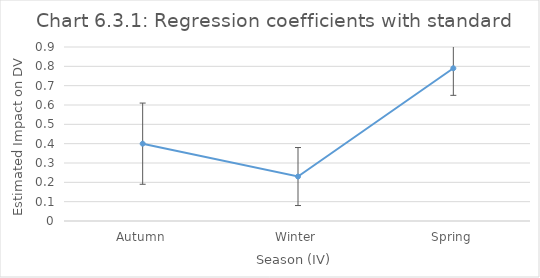
| Category | Est. coefficient |
|---|---|
| Autumn | 0.4 |
| Winter | 0.23 |
| Spring | 0.79 |